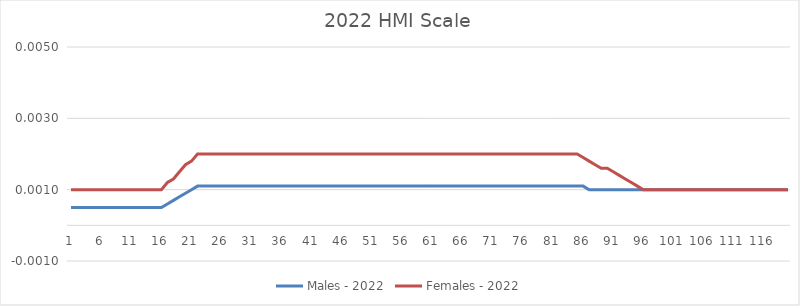
| Category |  Males - 2022  |  Females - 2022  |
|---|---|---|
| 0 | 0 | 0.001 |
| 1 | 0 | 0.001 |
| 2 | 0 | 0.001 |
| 3 | 0 | 0.001 |
| 4 | 0 | 0.001 |
| 5 | 0 | 0.001 |
| 6 | 0 | 0.001 |
| 7 | 0 | 0.001 |
| 8 | 0 | 0.001 |
| 9 | 0 | 0.001 |
| 10 | 0 | 0.001 |
| 11 | 0 | 0.001 |
| 12 | 0 | 0.001 |
| 13 | 0 | 0.001 |
| 14 | 0 | 0.001 |
| 15 | 0 | 0.001 |
| 16 | 0.001 | 0.001 |
| 17 | 0.001 | 0.001 |
| 18 | 0.001 | 0.002 |
| 19 | 0.001 | 0.002 |
| 20 | 0.001 | 0.002 |
| 21 | 0.001 | 0.002 |
| 22 | 0.001 | 0.002 |
| 23 | 0.001 | 0.002 |
| 24 | 0.001 | 0.002 |
| 25 | 0.001 | 0.002 |
| 26 | 0.001 | 0.002 |
| 27 | 0.001 | 0.002 |
| 28 | 0.001 | 0.002 |
| 29 | 0.001 | 0.002 |
| 30 | 0.001 | 0.002 |
| 31 | 0.001 | 0.002 |
| 32 | 0.001 | 0.002 |
| 33 | 0.001 | 0.002 |
| 34 | 0.001 | 0.002 |
| 35 | 0.001 | 0.002 |
| 36 | 0.001 | 0.002 |
| 37 | 0.001 | 0.002 |
| 38 | 0.001 | 0.002 |
| 39 | 0.001 | 0.002 |
| 40 | 0.001 | 0.002 |
| 41 | 0.001 | 0.002 |
| 42 | 0.001 | 0.002 |
| 43 | 0.001 | 0.002 |
| 44 | 0.001 | 0.002 |
| 45 | 0.001 | 0.002 |
| 46 | 0.001 | 0.002 |
| 47 | 0.001 | 0.002 |
| 48 | 0.001 | 0.002 |
| 49 | 0.001 | 0.002 |
| 50 | 0.001 | 0.002 |
| 51 | 0.001 | 0.002 |
| 52 | 0.001 | 0.002 |
| 53 | 0.001 | 0.002 |
| 54 | 0.001 | 0.002 |
| 55 | 0.001 | 0.002 |
| 56 | 0.001 | 0.002 |
| 57 | 0.001 | 0.002 |
| 58 | 0.001 | 0.002 |
| 59 | 0.001 | 0.002 |
| 60 | 0.001 | 0.002 |
| 61 | 0.001 | 0.002 |
| 62 | 0.001 | 0.002 |
| 63 | 0.001 | 0.002 |
| 64 | 0.001 | 0.002 |
| 65 | 0.001 | 0.002 |
| 66 | 0.001 | 0.002 |
| 67 | 0.001 | 0.002 |
| 68 | 0.001 | 0.002 |
| 69 | 0.001 | 0.002 |
| 70 | 0.001 | 0.002 |
| 71 | 0.001 | 0.002 |
| 72 | 0.001 | 0.002 |
| 73 | 0.001 | 0.002 |
| 74 | 0.001 | 0.002 |
| 75 | 0.001 | 0.002 |
| 76 | 0.001 | 0.002 |
| 77 | 0.001 | 0.002 |
| 78 | 0.001 | 0.002 |
| 79 | 0.001 | 0.002 |
| 80 | 0.001 | 0.002 |
| 81 | 0.001 | 0.002 |
| 82 | 0.001 | 0.002 |
| 83 | 0.001 | 0.002 |
| 84 | 0.001 | 0.002 |
| 85 | 0.001 | 0.002 |
| 86 | 0.001 | 0.002 |
| 87 | 0.001 | 0.002 |
| 88 | 0.001 | 0.002 |
| 89 | 0.001 | 0.002 |
| 90 | 0.001 | 0.002 |
| 91 | 0.001 | 0.001 |
| 92 | 0.001 | 0.001 |
| 93 | 0.001 | 0.001 |
| 94 | 0.001 | 0.001 |
| 95 | 0.001 | 0.001 |
| 96 | 0.001 | 0.001 |
| 97 | 0.001 | 0.001 |
| 98 | 0.001 | 0.001 |
| 99 | 0.001 | 0.001 |
| 100 | 0.001 | 0.001 |
| 101 | 0.001 | 0.001 |
| 102 | 0.001 | 0.001 |
| 103 | 0.001 | 0.001 |
| 104 | 0.001 | 0.001 |
| 105 | 0.001 | 0.001 |
| 106 | 0.001 | 0.001 |
| 107 | 0.001 | 0.001 |
| 108 | 0.001 | 0.001 |
| 109 | 0.001 | 0.001 |
| 110 | 0.001 | 0.001 |
| 111 | 0.001 | 0.001 |
| 112 | 0.001 | 0.001 |
| 113 | 0.001 | 0.001 |
| 114 | 0.001 | 0.001 |
| 115 | 0.001 | 0.001 |
| 116 | 0.001 | 0.001 |
| 117 | 0.001 | 0.001 |
| 118 | 0.001 | 0.001 |
| 119 | 0.001 | 0.001 |